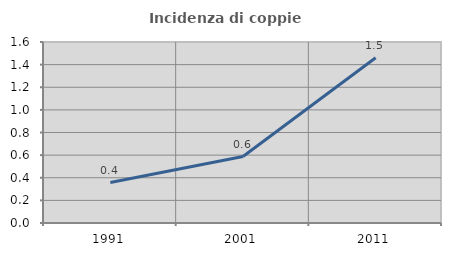
| Category | Incidenza di coppie miste |
|---|---|
| 1991.0 | 0.358 |
| 2001.0 | 0.588 |
| 2011.0 | 1.461 |